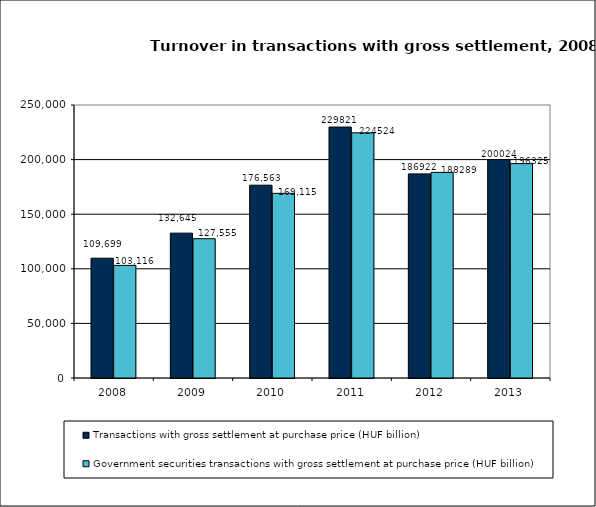
| Category | Transactions with gross settlement at purchase price (HUF billion) | Government securities transactions with gross settlement at purchase price (HUF billion) |
|---|---|---|
| 2008.0 | 109699 | 103116 |
| 2009.0 | 132645 | 127555 |
| 2010.0 | 176563 | 169115 |
| 2011.0 | 229821 | 224524 |
| 2012.0 | 186922 | 188289 |
| 2013.0 | 200024 | 196325 |